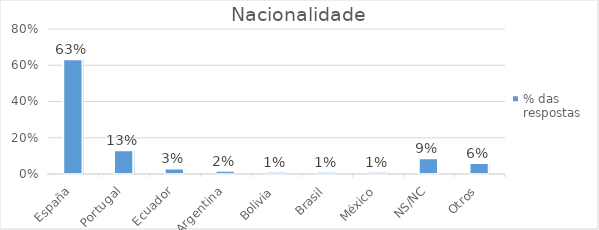
| Category | % das respostas |
|---|---|
| España | 0.633 |
| Portugal | 0.131 |
| Ecuador | 0.031 |
| Argentina | 0.017 |
| Bolivia | 0.013 |
| Brasil | 0.013 |
| México | 0.013 |
| NS/NC | 0.087 |
| Otros | 0.061 |